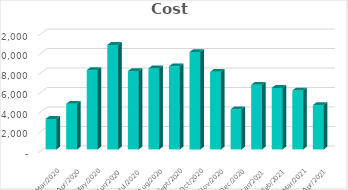
| Category | Cost |
|---|---|
| 2021-04-30 | 4545.26 |
| 2021-03-31 | 6045.99 |
| 2021-02-28 | 6306.68 |
| 2021-01-31 | 6638.18 |
| 2020-12-31 | 4116.46 |
| 2020-11-30 | 7953.91 |
| 2020-10-31 | 9987.42 |
| 2020-09-30 | 8527.4 |
| 2020-08-31 | 8309.03 |
| 2020-07-31 | 8025.64 |
| 2020-06-30 | 10720.08 |
| 2020-05-31 | 8134.96 |
| 2020-04-30 | 4679.42 |
| 2020-03-31 | 3129.75 |